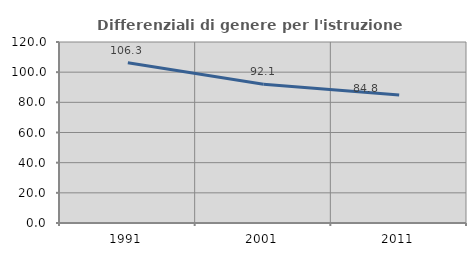
| Category | Differenziali di genere per l'istruzione superiore |
|---|---|
| 1991.0 | 106.272 |
| 2001.0 | 92.052 |
| 2011.0 | 84.808 |